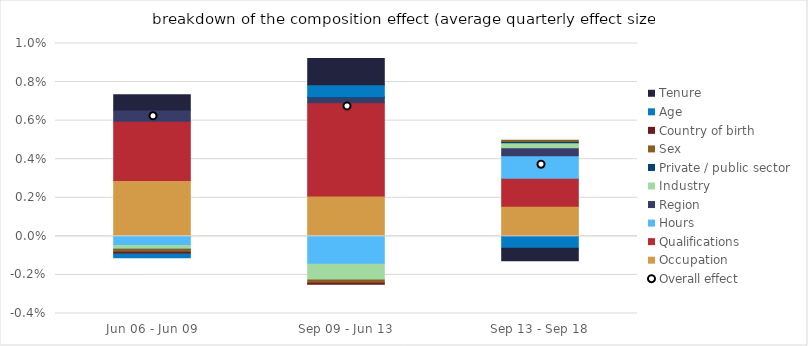
| Category | Occupation | Qualifications | Hours | Region | Industry | Private / public sector | Sex | Country of birth | Age | Tenure |
|---|---|---|---|---|---|---|---|---|---|---|
| Jun 06 - Jun 09 | 0.003 | 0.003 | 0 | 0.001 | 0 | 0 | 0 | 0 | 0 | 0.001 |
| Sep 09 - Jun 13 | 0.002 | 0.005 | -0.001 | 0 | -0.001 | 0 | 0 | 0 | 0.001 | 0.001 |
| Sep 13 - Sep 18 | 0.002 | 0.001 | 0.001 | 0 | 0 | 0 | 0 | 0 | -0.001 | -0.001 |